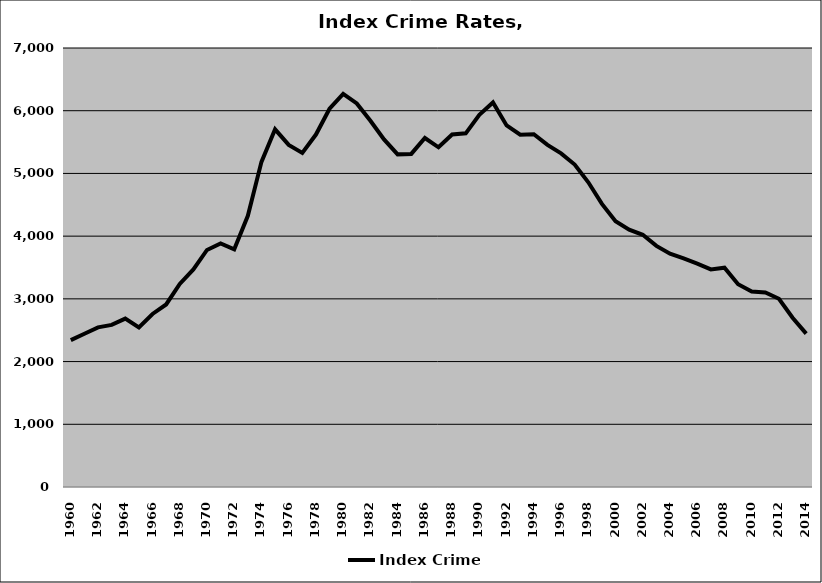
| Category | Index Crime |
|---|---|
| 1960.0 | 2341.844 |
| 1961.0 | 2444.512 |
| 1962.0 | 2546.018 |
| 1963.0 | 2585.268 |
| 1964.0 | 2685.385 |
| 1965.0 | 2545.876 |
| 1966.0 | 2759.252 |
| 1967.0 | 2910.539 |
| 1968.0 | 3237.853 |
| 1969.0 | 3468.462 |
| 1970.0 | 3779.574 |
| 1971.0 | 3885.343 |
| 1972.0 | 3791.121 |
| 1973.0 | 4324.929 |
| 1974.0 | 5184.26 |
| 1975.0 | 5703.49 |
| 1976.0 | 5455.223 |
| 1977.0 | 5327.71 |
| 1978.0 | 5619.826 |
| 1979.0 | 6031.077 |
| 1980.0 | 6269.098 |
| 1981.0 | 6115.653 |
| 1982.0 | 5840.304 |
| 1983.0 | 5541.407 |
| 1984.0 | 5304.187 |
| 1985.0 | 5311.253 |
| 1986.0 | 5564.597 |
| 1987.0 | 5416.526 |
| 1988.0 | 5620.868 |
| 1989.0 | 5639.166 |
| 1990.0 | 5935.085 |
| 1991.0 | 6132.054 |
| 1992.0 | 5765.317 |
| 1993.0 | 5617.928 |
| 1994.0 | 5625.851 |
| 1995.0 | 5455.689 |
| 1996.0 | 5319.988 |
| 1997.0 | 5141.131 |
| 1998.0 | 4858.497 |
| 1999.0 | 4514.704 |
| 2000.0 | 4239.162 |
| 2001.0 | 4104.702 |
| 2002.0 | 4022.088 |
| 2003.0 | 3844.238 |
| 2004.0 | 3719.717 |
| 2005.0 | 3643.952 |
| 2006.0 | 3561.23 |
| 2007.0 | 3468.962 |
| 2008.0 | 3496.758 |
| 2009.0 | 3234.073 |
| 2010.0 | 3116.168 |
| 2011.0 | 3102.634 |
| 2012.0 | 3001.68 |
| 2013.0 | 2699.683 |
| 2014.0 | 2445.915 |